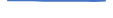
| Category | Series 0 |
|---|---|
| 0 | 83 |
| 1 | 87 |
| 2 | 82 |
| 3 | 62 |
| 4 | 71 |
| 5 | 65 |
| 6 | 77 |
| 7 | 55 |
| 8 | 76 |